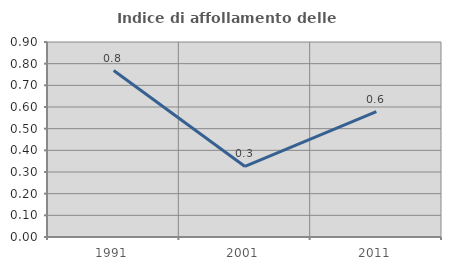
| Category | Indice di affollamento delle abitazioni  |
|---|---|
| 1991.0 | 0.768 |
| 2001.0 | 0.326 |
| 2011.0 | 0.579 |